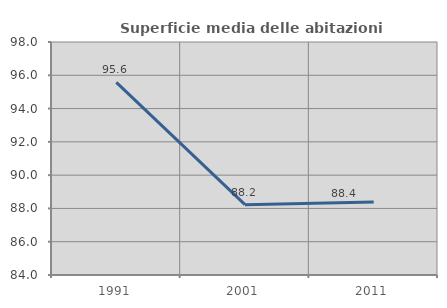
| Category | Superficie media delle abitazioni occupate |
|---|---|
| 1991.0 | 95.573 |
| 2001.0 | 88.226 |
| 2011.0 | 88.391 |